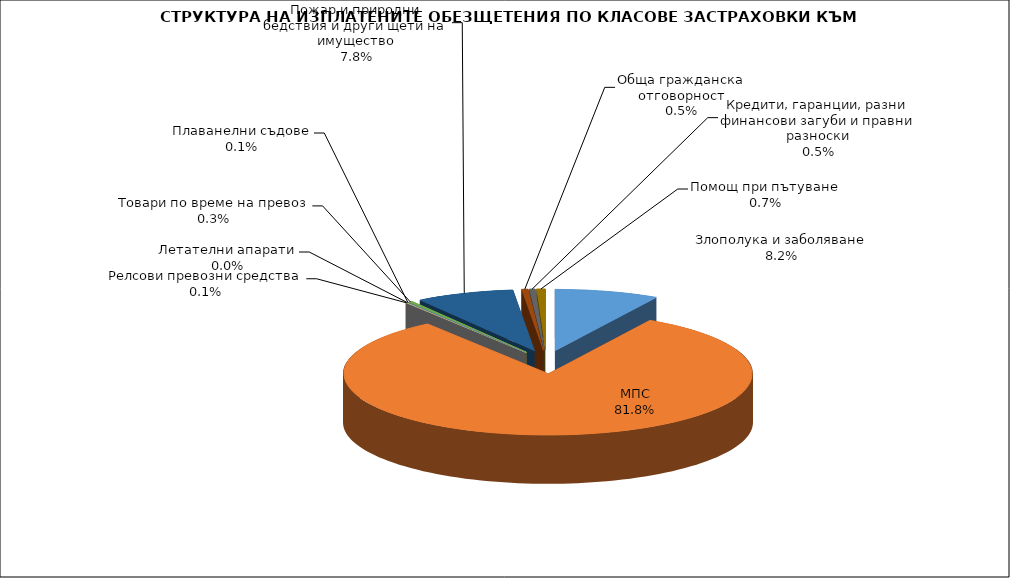
| Category | Злополука и заболяване |
|---|---|
| Злополука и заболяване | 0.082 |
| МПС | 0.818 |
| Релсови превозни средства | 0.001 |
| Летателни апарати | 0 |
| Плаванелни съдове | 0.001 |
| Товари по време на превоз | 0.003 |
| Пожар и природни бедствия и други щети на имущество | 0.078 |
| Обща гражданска отговорност | 0.005 |
| Кредити, гаранции, разни финансови загуби и правни разноски | 0.005 |
| Помощ при пътуване | 0.007 |